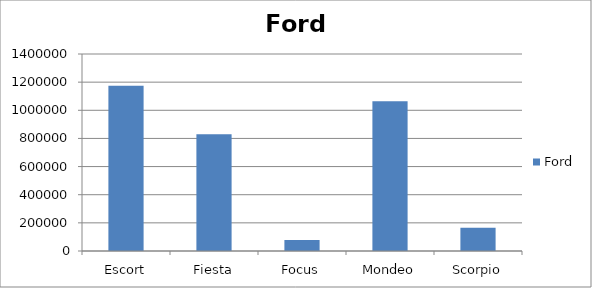
| Category | Ford |
|---|---|
| Escort | 1174000 |
| Fiesta | 830000 |
| Focus | 78000 |
| Mondeo | 1065000 |
| Scorpio | 165000 |